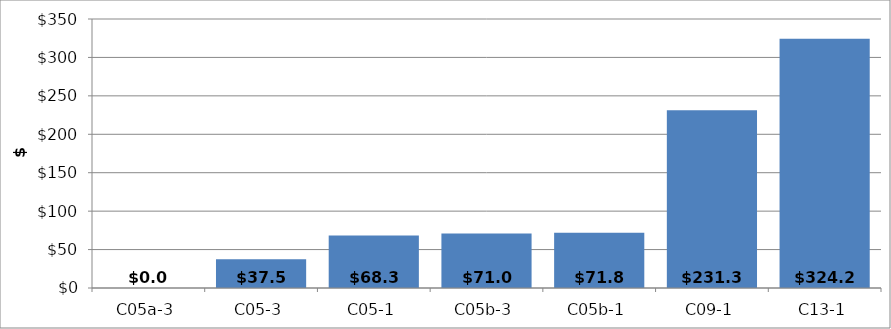
| Category | Change from Lowest |
|---|---|
| C05a-3 | 0 |
| C05-3 | 37.508 |
| C05-1 | 68.324 |
| C05b-3 | 71.007 |
| C05b-1 | 71.798 |
| C09-1 | 231.29 |
| C13-1 | 324.246 |